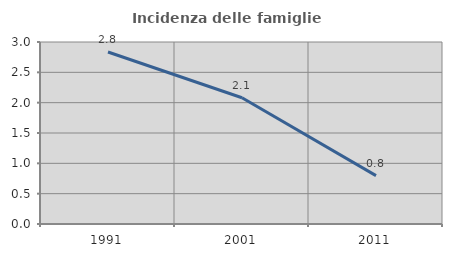
| Category | Incidenza delle famiglie numerose |
|---|---|
| 1991.0 | 2.835 |
| 2001.0 | 2.081 |
| 2011.0 | 0.797 |